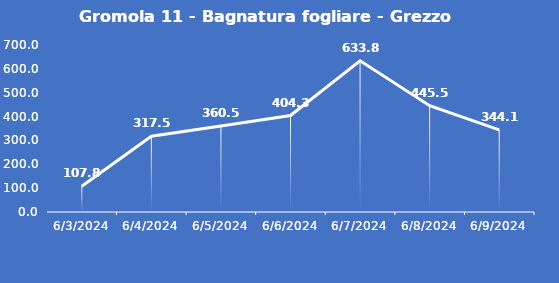
| Category | Gromola 11 - Bagnatura fogliare - Grezzo (min) |
|---|---|
| 6/3/24 | 107.8 |
| 6/4/24 | 317.5 |
| 6/5/24 | 360.5 |
| 6/6/24 | 404.3 |
| 6/7/24 | 633.8 |
| 6/8/24 | 445.5 |
| 6/9/24 | 344.1 |